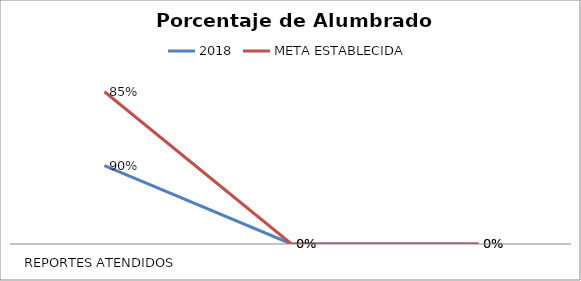
| Category | 2018 | META ESTABLECIDA |
|---|---|---|
| REPORTES ATENDIDOS | 0.9 | 0.85 |